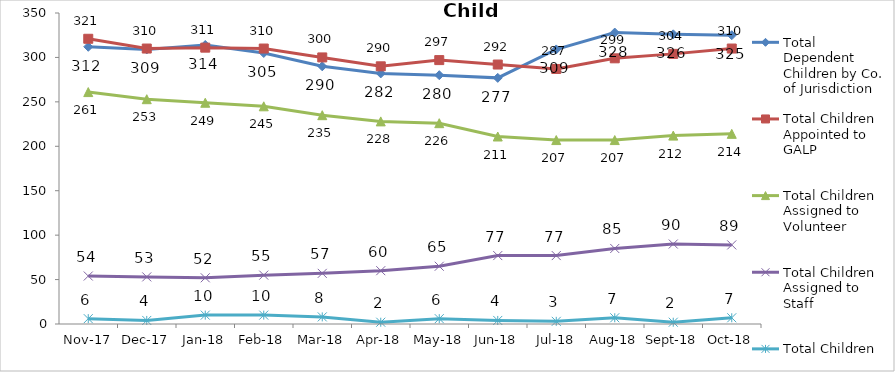
| Category | Total Dependent Children by Co. of Jurisdiction | Total Children Appointed to GALP | Total Children Assigned to Volunteer | Total Children Assigned to Staff | Total Children Unassigned |
|---|---|---|---|---|---|
| 2017-11-01 | 312 | 321 | 261 | 54 | 6 |
| 2017-12-01 | 309 | 310 | 253 | 53 | 4 |
| 2018-01-01 | 314 | 311 | 249 | 52 | 10 |
| 2018-02-01 | 305 | 310 | 245 | 55 | 10 |
| 2018-03-01 | 290 | 300 | 235 | 57 | 8 |
| 2018-04-01 | 282 | 290 | 228 | 60 | 2 |
| 2018-05-01 | 280 | 297 | 226 | 65 | 6 |
| 2018-06-01 | 277 | 292 | 211 | 77 | 4 |
| 2018-07-01 | 309 | 287 | 207 | 77 | 3 |
| 2018-08-01 | 328 | 299 | 207 | 85 | 7 |
| 2018-09-01 | 326 | 304 | 212 | 90 | 2 |
| 2018-10-01 | 325 | 310 | 214 | 89 | 7 |